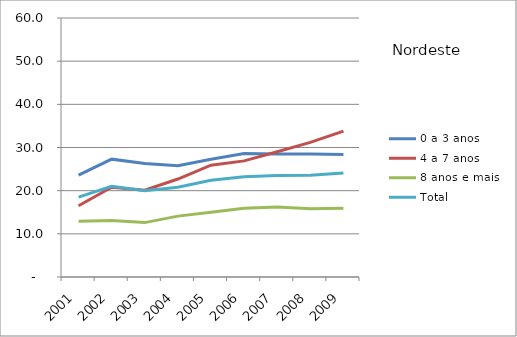
| Category | 0 a 3 anos | 4 a 7 anos | 8 anos e mais | Total |
|---|---|---|---|---|
| 2001.0 | 23.6 | 16.5 | 12.9 | 18.5 |
| 2002.0 | 27.3 | 20.8 | 13.1 | 21 |
| 2003.0 | 26.3 | 20.1 | 12.6 | 20 |
| 2004.0 | 25.8 | 22.7 | 14.1 | 20.8 |
| 2005.0 | 27.3 | 25.9 | 15 | 22.4 |
| 2006.0 | 28.6 | 26.9 | 15.9 | 23.2 |
| 2007.0 | 28.5 | 29 | 16.2 | 23.5 |
| 2008.0 | 28.5 | 31.2 | 15.8 | 23.6 |
| 2009.0 | 28.4 | 33.8 | 15.9 | 24.1 |